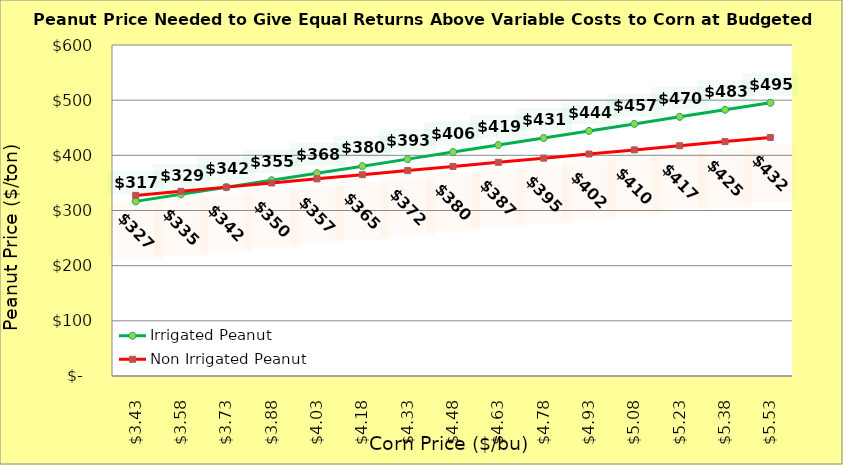
| Category | Irrigated Peanut | Non Irrigated Peanut |
|---|---|---|
| 3.4299999999999997 | 316.561 | 327.361 |
| 3.5799999999999996 | 329.327 | 334.861 |
| 3.7299999999999995 | 342.093 | 342.361 |
| 3.8799999999999994 | 354.859 | 349.861 |
| 4.029999999999999 | 367.625 | 357.361 |
| 4.18 | 380.391 | 364.861 |
| 4.33 | 393.157 | 372.361 |
| 4.48 | 405.923 | 379.861 |
| 4.630000000000001 | 418.689 | 387.361 |
| 4.780000000000001 | 431.455 | 394.861 |
| 4.9300000000000015 | 444.221 | 402.361 |
| 5.080000000000002 | 456.987 | 409.861 |
| 5.230000000000002 | 469.753 | 417.361 |
| 5.380000000000003 | 482.519 | 424.861 |
| 5.530000000000003 | 495.285 | 432.361 |